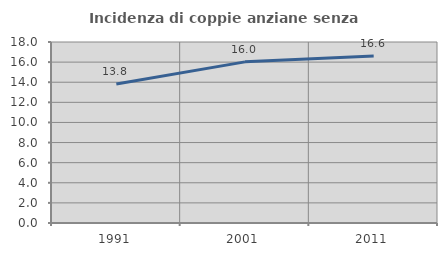
| Category | Incidenza di coppie anziane senza figli  |
|---|---|
| 1991.0 | 13.819 |
| 2001.0 | 16.024 |
| 2011.0 | 16.61 |